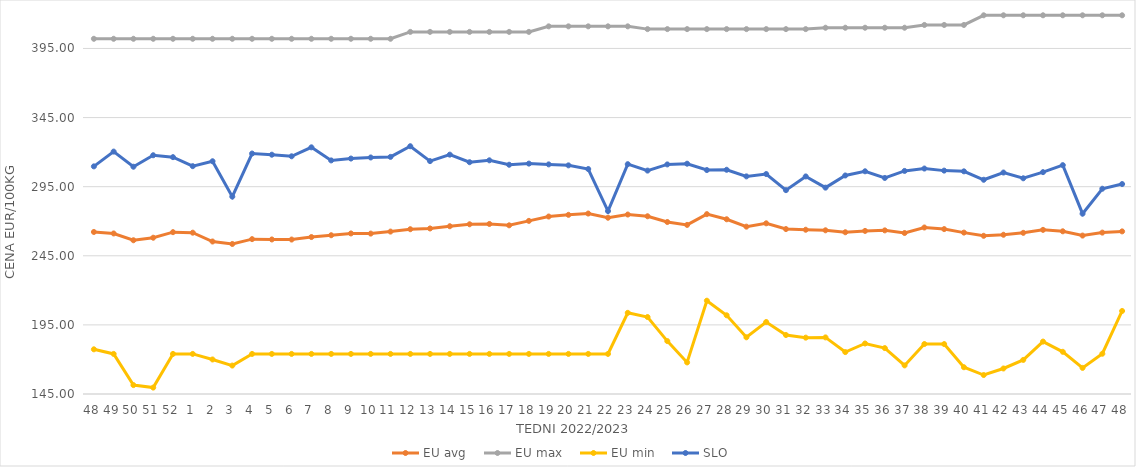
| Category | EU avg | EU max | EU min | SLO |
|---|---|---|---|---|
| 48.0 | 262.225 | 402 | 177.332 | 309.69 |
| 49.0 | 261.152 | 402 | 174 | 320.38 |
| 50.0 | 256.24 | 402 | 151.434 | 309.44 |
| 51.0 | 258.071 | 402 | 149.638 | 317.74 |
| 52.0 | 262.088 | 402 | 174 | 316.36 |
| 1.0 | 261.716 | 402 | 174 | 309.84 |
| 2.0 | 255.331 | 402 | 169.983 | 313.4 |
| 3.0 | 253.546 | 402 | 165.574 | 287.81 |
| 4.0 | 257.051 | 402 | 174 | 318.98 |
| 5.0 | 256.808 | 402 | 174 | 318.13 |
| 6.0 | 256.75 | 402 | 174 | 316.99 |
| 7.0 | 258.565 | 402 | 174 | 323.47 |
| 8.0 | 259.872 | 402 | 174 | 314 |
| 9.0 | 261.164 | 402 | 174 | 315.35 |
| 10.0 | 261.06 | 402 | 174 | 316.13 |
| 11.0 | 262.513 | 402 | 174 | 316.55 |
| 12.0 | 264.228 | 407 | 174 | 324.27 |
| 13.0 | 264.768 | 407 | 174 | 313.49 |
| 14.0 | 266.385 | 407 | 174 | 318.17 |
| 15.0 | 267.797 | 407 | 174 | 312.7 |
| 16.0 | 268.021 | 407 | 174 | 314.07 |
| 17.0 | 267.041 | 407 | 174 | 310.87 |
| 18.0 | 270.255 | 407 | 174 | 311.69 |
| 19.0 | 273.406 | 411 | 174 | 311.13 |
| 20.0 | 274.631 | 411 | 174 | 310.42 |
| 21.0 | 275.561 | 411 | 174 | 307.76 |
| 22.0 | 272.542 | 411 | 174 | 277.34 |
| 23.0 | 274.85 | 411 | 203.728 | 311.28 |
| 24.0 | 273.59 | 409 | 200.686 | 306.64 |
| 25.0 | 269.439 | 409 | 183.275 | 311.1 |
| 26.0 | 267.345 | 409 | 167.858 | 311.62 |
| 27.0 | 275.123 | 409 | 212.506 | 307.04 |
| 28.0 | 271.42 | 409 | 201.945 | 307.23 |
| 29.0 | 266.08 | 409 | 186.018 | 302.45 |
| 30.0 | 268.49 | 409 | 197.093 | 304.14 |
| 31.0 | 264.334 | 409 | 187.684 | 292.49 |
| 32.0 | 263.844 | 409 | 185.774 | 302.41 |
| 33.0 | 263.441 | 410 | 185.951 | 294.3 |
| 34.0 | 262.028 | 410 | 175.332 | 303.1 |
| 35.0 | 262.997 | 410 | 181.543 | 306.13 |
| 36.0 | 263.389 | 410 | 178.207 | 301.32 |
| 37.0 | 261.486 | 410 | 165.697 | 306.4 |
| 38.0 | 265.47 | 412 | 181.159 | 308.12 |
| 39.0 | 264.316 | 412 | 181.124 | 306.62 |
| 40.0 | 261.774 | 412 | 164.37 | 306.1 |
| 41.0 | 259.456 | 419 | 158.728 | 300 |
| 42.0 | 260.21 | 419 | 163.464 | 305.24 |
| 43.0 | 261.605 | 419 | 169.66 | 301.07 |
| 44.0 | 263.758 | 419 | 182.925 | 305.52 |
| 45.0 | 262.714 | 419 | 175.524 | 310.58 |
| 46.0 | 259.625 | 419 | 163.882 | 275.46 |
| 47.0 | 261.772 | 419 | 174.136 | 293.51 |
| 48.0 | 262.659 | 419 | 205.067 | 296.9 |